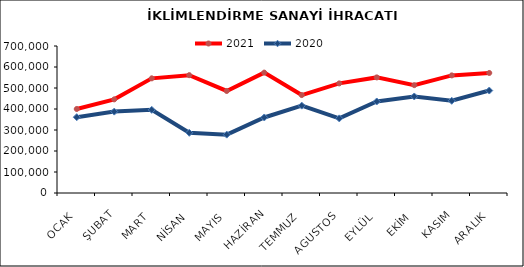
| Category | 2021 | 2020 |
|---|---|---|
| OCAK | 400036.984 | 360909.503 |
| ŞUBAT | 445946.957 | 387544.99 |
| MART | 545986.38 | 395991.823 |
| NİSAN | 561099.461 | 286875.192 |
| MAYIS | 485880.883 | 277937.776 |
| HAZİRAN | 573260.484 | 359614.306 |
| TEMMUZ | 466268.548 | 415949.288 |
| AGUSTOS | 521933.079 | 355291.086 |
| EYLÜL | 550457.228 | 435734.025 |
| EKİM | 513570.26 | 459634.504 |
| KASIM | 560067.425 | 439230.069 |
| ARALIK | 571616.131 | 487899.764 |